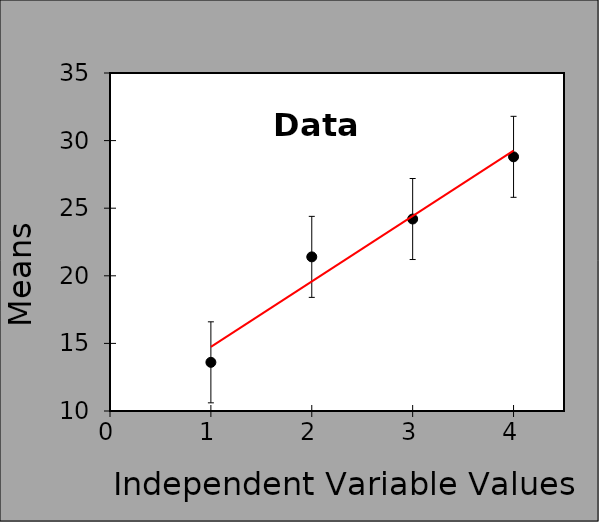
| Category | Series 0 |
|---|---|
| 1.0 | 13.6 |
| 2.0 | 21.4 |
| 3.0 | 24.2 |
| 4.0 | 28.8 |